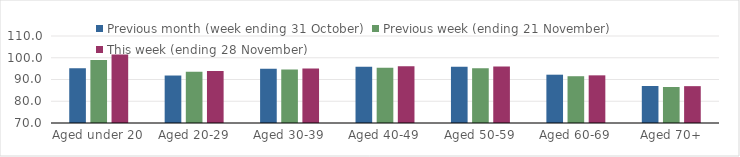
| Category | Previous month (week ending 31 October) | Previous week (ending 21 November) | This week (ending 28 November) |
|---|---|---|---|
| Aged under 20 | 95.19 | 99.01 | 101.51 |
| Aged 20-29 | 91.83 | 93.54 | 93.91 |
| Aged 30-39 | 94.92 | 94.63 | 95.03 |
| Aged 40-49 | 95.9 | 95.39 | 96.09 |
| Aged 50-59 | 95.85 | 95.2 | 96 |
| Aged 60-69 | 92.21 | 91.51 | 91.91 |
| Aged 70+ | 87.01 | 86.54 | 86.94 |